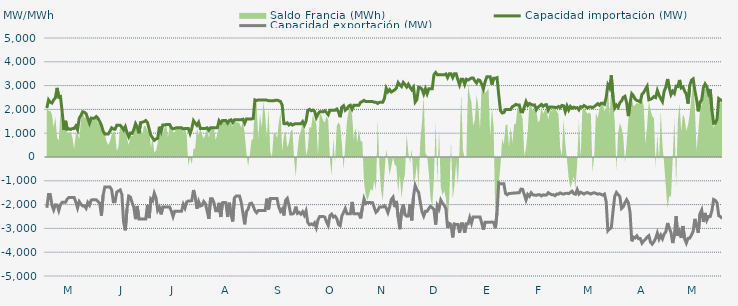
| Category | Capacidad importación (MW) | Capacidad exportación (MW) |
|---|---|---|
| 0 | 2056.25 | -2133.333 |
| 1900-01-01 | 2400 | -1570.833 |
| 1900-01-02 | 2300 | -1570.833 |
| 1900-01-03 | 2266.667 | -2031.25 |
| 1900-01-04 | 2400 | -2225 |
| 1900-01-05 | 2487.5 | -2010.417 |
| 1900-01-06 | 2904.167 | -2016.667 |
| 1900-01-07 | 2512.5 | -2250 |
| 1900-01-08 | 2541.667 | -2000 |
| 1900-01-09 | 1884.392 | -1900 |
| 1900-01-10 | 1133.333 | -1900 |
| 1900-01-11 | 1520.875 | -1900 |
| 1900-01-12 | 1166.667 | -1758.333 |
| 1900-01-13 | 1183.333 | -1700 |
| 1900-01-14 | 1158.333 | -1700 |
| 1900-01-15 | 1200 | -1700 |
| 1900-01-16 | 1200 | -1700 |
| 1900-01-17 | 1304.583 | -1887.5 |
| 1900-01-18 | 1145.417 | -2139.583 |
| 1900-01-19 | 1629.167 | -1875 |
| 1900-01-20 | 1750 | -1987.5 |
| 1900-01-21 | 1900 | -2058.333 |
| 1900-01-22 | 1879.167 | -2050 |
| 1900-01-23 | 1820.833 | -2156.25 |
| 1900-01-24 | 1616.667 | -1912.5 |
| 1900-01-25 | 1420.833 | -2027.083 |
| 1900-01-26 | 1633.333 | -1812.5 |
| 1900-01-27 | 1625 | -1791.667 |
| 1900-01-28 | 1637.5 | -1791.667 |
| 1900-01-29 | 1700 | -1800 |
| 1900-01-30 | 1620.833 | -1868.75 |
| 1900-01-31 | 1487.5 | -1937.5 |
| 1900-02-01 | 1337.5 | -2464.583 |
| 1900-02-02 | 1083.333 | -1610.417 |
| 1900-02-03 | 966.667 | -1258.333 |
| 1900-02-04 | 966.667 | -1258.333 |
| 1900-02-05 | 966.667 | -1258.333 |
| 1900-02-06 | 1083.333 | -1258.333 |
| 1900-02-07 | 1225 | -1375 |
| 1900-02-08 | 1175 | -1875 |
| 1900-02-09 | 1166.667 | -1875 |
| 1900-02-10 | 1333.333 | -1475 |
| 1900-02-11 | 1333.333 | -1425 |
| 1900-02-12 | 1333.333 | -1383.333 |
| 1900-02-13 | 1254.167 | -1577.083 |
| 1900-02-14 | 1133.333 | -2725 |
| 1900-02-15 | 1275 | -3081.25 |
| 1900-02-16 | 1029.167 | -2189.583 |
| 1900-02-17 | 850 | -1641.667 |
| 1900-02-18 | 1008.333 | -1683.333 |
| 1900-02-19 | 991.667 | -1916.667 |
| 1900-02-20 | 1150 | -2114.583 |
| 1900-02-21 | 1400 | -2612.5 |
| 1900-02-22 | 1262.5 | -2058.333 |
| 1900-02-23 | 995.833 | -2600 |
| 1900-02-24 | 1445.833 | -2600 |
| 1900-02-25 | 1458.333 | -2600 |
| 1900-02-26 | 1483.333 | -2600 |
| 1900-02-27 | 1533.333 | -2600 |
| 1900-02-28 | 1450 | -2012.5 |
| 1900-02-28 | 1175 | -2566.667 |
| 1900-03-01 | 912.5 | -1762.5 |
| 1900-03-02 | 806.25 | -1841.667 |
| 1900-03-03 | 700 | -1520.833 |
| 1900-03-04 | 756.25 | -1710.417 |
| 1900-03-05 | 783.333 | -2239.583 |
| 1900-03-06 | 1270.833 | -2112.5 |
| 1900-03-07 | 1066.667 | -2410.417 |
| 1900-03-08 | 1345.833 | -2104.167 |
| 1900-03-09 | 1341.667 | -2104.167 |
| 1900-03-10 | 1366.667 | -2104.167 |
| 1900-03-11 | 1366.667 | -2104.167 |
| 1900-03-12 | 1366.667 | -2104.167 |
| 1900-03-13 | 1231.25 | -2275 |
| 1900-03-14 | 1181.25 | -2504.167 |
| 1900-03-15 | 1200 | -2275 |
| 1900-03-16 | 1233.333 | -2275 |
| 1900-03-17 | 1233.333 | -2275 |
| 1900-03-18 | 1233.333 | -2275 |
| 1900-03-19 | 1233.333 | -2275 |
| 1900-03-20 | 1175 | -1987.5 |
| 1900-03-21 | 1200 | -2147.917 |
| 1900-03-22 | 1200 | -1887.5 |
| 1900-03-23 | 1200 | -1850 |
| 1900-03-24 | 987.5 | -1850 |
| 1900-03-25 | 1200 | -1831.25 |
| 1900-03-26 | 1529.167 | -1387.5 |
| 1900-03-27 | 1427.083 | -1679.167 |
| 1900-03-28 | 1331.25 | -2172.917 |
| 1900-03-29 | 1456.25 | -1868.75 |
| 1900-03-30 | 1200 | -2060.417 |
| 1900-03-31 | 1200 | -2029.167 |
| 1900-04-01 | 1200 | -1868.75 |
| 1900-04-02 | 1200 | -1958.333 |
| 1900-04-03 | 1225 | -2275 |
| 1900-04-04 | 1125 | -2595.833 |
| 1900-04-05 | 1233.333 | -1750 |
| 1900-04-06 | 1233.333 | -1750 |
| 1900-04-07 | 1233.333 | -1925 |
| 1900-04-08 | 1233.333 | -2262.5 |
| 1900-04-09 | 1233.333 | -2262.5 |
| 1900-04-10 | 1525 | -1925 |
| 1900-04-11 | 1425 | -2520.833 |
| 1900-04-12 | 1533.333 | -1920.833 |
| 1900-04-13 | 1533.333 | -1908.333 |
| 1900-04-14 | 1533.333 | -1920.833 |
| 1900-04-15 | 1425 | -2520.833 |
| 1900-04-16 | 1533.333 | -1920.833 |
| 1900-04-17 | 1562.5 | -2412.5 |
| 1900-04-18 | 1454.167 | -2710.417 |
| 1900-04-19 | 1566.667 | -1712.5 |
| 1900-04-20 | 1566.667 | -1641.667 |
| 1900-04-21 | 1566.667 | -1641.667 |
| 1900-04-22 | 1566.667 | -1641.667 |
| 1900-04-23 | 1566.667 | -1904.167 |
| 1900-04-24 | 1587.5 | -2362.5 |
| 1900-04-25 | 1418.75 | -2827.083 |
| 1900-04-26 | 1595.833 | -2297.917 |
| 1900-04-27 | 1595.833 | -2193.75 |
| 1900-04-28 | 1595.833 | -1964.583 |
| 1900-04-29 | 1595.833 | -1937.5 |
| 1900-04-30 | 1618.75 | -2058.333 |
| 1900-05-01 | 2400 | -2250 |
| 1900-05-02 | 2375 | -2341.667 |
| 1900-05-03 | 2400 | -2250 |
| 1900-05-04 | 2400 | -2250 |
| 1900-05-05 | 2400 | -2250 |
| 1900-05-06 | 2400 | -2250 |
| 1900-05-07 | 2400 | -2250 |
| 1900-05-08 | 2387.5 | -1750 |
| 1900-05-09 | 2364.583 | -2208.333 |
| 1900-05-10 | 2364.583 | -1745.833 |
| 1900-05-11 | 2360.417 | -1745.833 |
| 1900-05-12 | 2358.333 | -1745.833 |
| 1900-05-13 | 2387.5 | -1745.833 |
| 1900-05-14 | 2387.5 | -1745.833 |
| 1900-05-15 | 2362.5 | -2100 |
| 1900-05-16 | 2335.417 | -2283.333 |
| 1900-05-17 | 2181.25 | -2187.5 |
| 1900-05-18 | 1408.333 | -2456.25 |
| 1900-05-19 | 1395.833 | -1820.833 |
| 1900-05-20 | 1433.333 | -1737.5 |
| 1900-05-21 | 1345.833 | -2037.5 |
| 1900-05-22 | 1400 | -2400 |
| 1900-05-23 | 1341.667 | -2400 |
| 1900-05-24 | 1383.333 | -2345.833 |
| 1900-05-25 | 1400 | -2087.5 |
| 1900-05-26 | 1400 | -2370.833 |
| 1900-05-27 | 1400 | -2327.083 |
| 1900-05-28 | 1400 | -2400 |
| 1900-05-29 | 1487.5 | -2300 |
| 1900-05-30 | 1337.5 | -2445.833 |
| 1900-05-31 | 1500 | -2266.667 |
| 1900-06-01 | 1958.333 | -2750 |
| 1900-06-02 | 2000 | -2850 |
| 1900-06-03 | 1941.667 | -2812.5 |
| 1900-06-04 | 1975 | -2850 |
| 1900-06-05 | 1920.833 | -2762.5 |
| 1900-06-06 | 1654.167 | -2968.75 |
| 1900-06-07 | 1808.333 | -2639.583 |
| 1900-06-08 | 1900 | -2500 |
| 1900-06-09 | 1900 | -2500 |
| 1900-06-10 | 1900 | -2500 |
| 1900-06-11 | 1950 | -2525 |
| 1900-06-12 | 1866.667 | -2727.083 |
| 1900-06-13 | 1775 | -2877.083 |
| 1900-06-14 | 1966.667 | -2462.5 |
| 1900-06-15 | 1966.667 | -2400 |
| 1900-06-16 | 1966.667 | -2525 |
| 1900-06-17 | 1966.667 | -2483.333 |
| 1900-06-18 | 2016.667 | -2583.333 |
| 1900-06-19 | 1900 | -2837.5 |
| 1900-06-20 | 1675 | -2887.5 |
| 1900-06-21 | 2091.667 | -2477.083 |
| 1900-06-22 | 2154.167 | -2325 |
| 1900-06-23 | 1962.5 | -2162.5 |
| 1900-06-24 | 2029.167 | -2387.5 |
| 1900-06-25 | 2137.5 | -2387.5 |
| 1900-06-26 | 2175 | -2387.5 |
| 1900-06-27 | 2010 | -1886 |
| 1900-06-28 | 2170.833 | -2383.333 |
| 1900-06-29 | 2170.833 | -2383.333 |
| 1900-06-30 | 2170.833 | -2383.333 |
| 1900-07-01 | 2170.833 | -2383.333 |
| 1900-07-02 | 2300 | -2579.167 |
| 1900-07-03 | 2331.25 | -2131.25 |
| 1900-07-04 | 2379.167 | -1758.333 |
| 1900-07-05 | 2329.167 | -1960.417 |
| 1900-07-06 | 2329.167 | -1916.667 |
| 1900-07-07 | 2329.167 | -1916.667 |
| 1900-07-08 | 2329.167 | -1916.667 |
| 1900-07-09 | 2329.167 | -1918.75 |
| 1900-07-10 | 2300 | -2131.25 |
| 1900-07-11 | 2300 | -2325 |
| 1900-07-12 | 2250 | -2256.25 |
| 1900-07-13 | 2300 | -2104.167 |
| 1900-07-14 | 2300 | -2104.167 |
| 1900-07-15 | 2300 | -2104.167 |
| 1900-07-16 | 2475 | -2043.75 |
| 1900-07-17 | 2887.5 | -2150 |
| 1900-07-18 | 2737.5 | -2335.417 |
| 1900-07-19 | 2829.167 | -2106.25 |
| 1900-07-20 | 2732.25 | -1787 |
| 1900-07-21 | 2775 | -1691.667 |
| 1900-07-22 | 2820.833 | -2106.25 |
| 1900-07-23 | 2900 | -1845.833 |
| 1900-07-24 | 3125 | -2520.833 |
| 1900-07-25 | 3025 | -3033.333 |
| 1900-07-26 | 2956.25 | -2250 |
| 1900-07-27 | 3133.333 | -1987.5 |
| 1900-07-28 | 3045.833 | -2425 |
| 1900-07-29 | 2941.667 | -2485.417 |
| 1900-07-30 | 3058.333 | -2483.333 |
| 1900-07-31 | 2925 | -1975 |
| 1900-08-01 | 2825 | -2662.5 |
| 1900-08-02 | 2933.333 | -1658.333 |
| 1900-08-03 | 2312.5 | -1195.833 |
| 1900-08-04 | 2412.5 | -1375 |
| 1900-08-05 | 2933.333 | -1483.333 |
| 1900-08-06 | 2910.417 | -1912.5 |
| 1900-08-07 | 2850 | -2300 |
| 1900-08-08 | 2650 | -2483.333 |
| 1900-08-09 | 2866.667 | -2283.333 |
| 1900-08-10 | 2658.333 | -2283.333 |
| 1900-08-11 | 2866.667 | -2162.5 |
| 1900-08-12 | 2866.667 | -2066.667 |
| 1900-08-13 | 2866.667 | -2129.167 |
| 1900-08-14 | 3456.25 | -2204.167 |
| 1900-08-15 | 3550 | -2837.5 |
| 1900-08-16 | 3454.167 | -2041.667 |
| 1900-08-17 | 3454.167 | -2179.167 |
| 1900-08-18 | 3454.167 | -1808.333 |
| 1900-08-19 | 3454.167 | -1938.75 |
| 1900-08-20 | 3454.167 | -2029.167 |
| 1900-08-21 | 3487.5 | -2175 |
| 1900-08-22 | 3337.5 | -2983.333 |
| 1900-08-23 | 3500 | -2791.667 |
| 1900-08-24 | 3500 | -2833.333 |
| 1900-08-25 | 3337.5 | -3379.167 |
| 1900-08-26 | 3500 | -2812.5 |
| 1900-08-27 | 3500 | -2833.333 |
| 1900-08-28 | 3250 | -2837.5 |
| 1900-08-29 | 3028.25 | -3181.25 |
| 1900-08-30 | 3266.667 | -2808.333 |
| 1900-08-31 | 3266.667 | -2808.333 |
| 1900-09-01 | 3050 | -3181.25 |
| 1900-09-02 | 3266.667 | -2808.333 |
| 1900-09-03 | 3233.333 | -2808.333 |
| 1900-09-04 | 3275 | -2543.75 |
| 1900-09-05 | 3320.833 | -2779.167 |
| 1900-09-06 | 3320.833 | -2516.667 |
| 1900-09-07 | 3195.833 | -2516.667 |
| 1900-09-08 | 3108.333 | -2516.667 |
| 1900-09-09 | 3241.667 | -2516.667 |
| 1900-09-10 | 3212.5 | -2516.667 |
| 1900-09-11 | 3054.167 | -2775 |
| 1900-09-12 | 2862.5 | -3058.333 |
| 1900-09-13 | 3162.5 | -2741.667 |
| 1900-09-14 | 3366.667 | -2741.667 |
| 1900-09-15 | 3366.667 | -2741.667 |
| 1900-09-16 | 3366.667 | -2741.667 |
| 1900-09-17 | 3041.667 | -2729.167 |
| 1900-09-18 | 3306.25 | -2750 |
| 1900-09-19 | 3306.25 | -2991.667 |
| 1900-09-20 | 3333.333 | -2337.5 |
| 1900-09-21 | 2602.083 | -1083.333 |
| 1900-09-22 | 1950 | -1125 |
| 1900-09-23 | 1850 | -1125 |
| 1900-09-24 | 1866.667 | -1125 |
| 1900-09-25 | 2000 | -1537.5 |
| 1900-09-26 | 2000 | -1587.5 |
| 1900-09-27 | 2000 | -1529.167 |
| 1900-09-28 | 2000 | -1529.167 |
| 1900-09-29 | 2114.583 | -1525 |
| 1900-09-30 | 2154.167 | -1512.5 |
| 1900-10-01 | 2210.417 | -1516.667 |
| 1900-10-02 | 2183.333 | -1500 |
| 1900-10-03 | 2185.417 | -1500 |
| 1900-10-04 | 1906.25 | -1350 |
| 1900-10-05 | 1893.75 | -1358.333 |
| 1900-10-06 | 2104.167 | -1579.167 |
| 1900-10-07 | 2328.375 | -1804.167 |
| 1900-10-08 | 2166.667 | -1572.917 |
| 1900-10-09 | 2250 | -1650 |
| 1900-10-10 | 2212.5 | -1502.083 |
| 1900-10-11 | 2179.167 | -1589.583 |
| 1900-10-12 | 2187.5 | -1600 |
| 1900-10-13 | 1987.5 | -1612.5 |
| 1900-10-14 | 2091.667 | -1581.25 |
| 1900-10-15 | 2147.917 | -1581.25 |
| 1900-10-16 | 2208.333 | -1635.417 |
| 1900-10-17 | 2127.083 | -1589.583 |
| 1900-10-18 | 2185.417 | -1604.167 |
| 1900-10-19 | 2200 | -1597.917 |
| 1900-10-20 | 1966.667 | -1500 |
| 1900-10-21 | 2104.167 | -1545.833 |
| 1900-10-22 | 2102.083 | -1583.333 |
| 1900-10-23 | 2089.583 | -1581.25 |
| 1900-10-24 | 2085.417 | -1627.083 |
| 1900-10-25 | 2075 | -1554.167 |
| 1900-10-26 | 2122.917 | -1562.5 |
| 1900-10-27 | 2072.917 | -1508.333 |
| 1900-10-28 | 2166.667 | -1539.583 |
| 1900-10-29 | 2152.083 | -1560.417 |
| 1900-10-30 | 1908.333 | -1531.25 |
| 1900-10-31 | 2145.833 | -1525 |
| 1900-11-01 | 1972.917 | -1539.583 |
| 1900-11-02 | 2125 | -1491.667 |
| 1900-11-03 | 2050 | -1437.5 |
| 1900-11-04 | 2095.833 | -1539.583 |
| 1900-11-05 | 2062.5 | -1562.5 |
| 1900-11-06 | 2075 | -1368.75 |
| 1900-11-07 | 1979.167 | -1556.25 |
| 1900-11-08 | 2116.667 | -1481.25 |
| 1900-11-09 | 2093.75 | -1516.667 |
| 1900-11-10 | 2164.583 | -1556.25 |
| 1900-11-11 | 2116.667 | -1508.333 |
| 1900-11-12 | 2060.417 | -1493.75 |
| 1900-11-13 | 2102.083 | -1525 |
| 1900-11-14 | 2100 | -1556.25 |
| 1900-11-15 | 2075 | -1520.833 |
| 1900-11-16 | 2118.75 | -1500 |
| 1900-11-17 | 2177.083 | -1529.167 |
| 1900-11-18 | 2239.583 | -1562.5 |
| 1900-11-19 | 2177.083 | -1543.75 |
| 1900-11-20 | 2262.5 | -1568.75 |
| 1900-11-21 | 2260.417 | -1602.083 |
| 1900-11-22 | 2214.583 | -1556.25 |
| 1900-11-23 | 2506.25 | -1879.583 |
| 1900-11-24 | 3029.083 | -3096.667 |
| 1900-11-25 | 2897.083 | -3021.292 |
| 1900-11-26 | 3432.292 | -2977.083 |
| 1900-11-27 | 2507.25 | -2284.333 |
| 1900-11-28 | 2060.87 | -1658.696 |
| 1900-11-29 | 2179.167 | -1489.583 |
| 1900-11-30 | 2087.5 | -1575 |
| 1900-12-01 | 2277.417 | -1660.417 |
| 1900-12-02 | 2351.25 | -2160.417 |
| 1900-12-03 | 2503.458 | -2091.667 |
| 1900-12-04 | 2550 | -1920.833 |
| 1900-12-05 | 2281.458 | -1791.667 |
| 1900-12-06 | 1718.75 | -1920.833 |
| 1900-12-07 | 2254.5 | -2322.583 |
| 1900-12-08 | 2658.208 | -3541.417 |
| 1900-12-09 | 2574.708 | -3362.292 |
| 1900-12-10 | 2431.25 | -3398.958 |
| 1900-12-11 | 2374.5 | -3312.25 |
| 1900-12-12 | 2351.333 | -3435.417 |
| 1900-12-13 | 2317.583 | -3426.125 |
| 1900-12-14 | 2635.542 | -3620.708 |
| 1900-12-15 | 2711.542 | -3524.292 |
| 1900-12-16 | 2845.917 | -3464.708 |
| 1900-12-17 | 2969.417 | -3364.5 |
| 1900-12-18 | 2400.667 | -3304.667 |
| 1900-12-19 | 2423.292 | -3576.333 |
| 1900-12-20 | 2466.583 | -3661.208 |
| 1900-12-21 | 2539.583 | -3559.167 |
| 1900-12-22 | 2499 | -3412.958 |
| 1900-12-23 | 2794.042 | -3192.833 |
| 1900-12-24 | 2600.917 | -3446.833 |
| 1900-12-25 | 2454.333 | -3287.042 |
| 1900-12-26 | 2327 | -3437.333 |
| 1900-12-27 | 2764.875 | -3237.25 |
| 1900-12-28 | 2938.333 | -3142.542 |
| 1900-12-29 | 3277.667 | -2773.208 |
| 1900-12-30 | 2901.792 | -2987.042 |
| 1900-12-31 | 2620.125 | -3170.125 |
| 1901-01-01 | 2763 | -3616.833 |
| 1901-01-02 | 2671.542 | -3275.667 |
| 1901-01-03 | 2975.208 | -2481.333 |
| 1901-01-04 | 2963.292 | -3314.083 |
| 1901-01-05 | 3237.125 | -3127.25 |
| 1901-01-06 | 2903.125 | -3401.25 |
| 1901-01-07 | 2943.875 | -2899.917 |
| 1901-01-08 | 2767.417 | -3439.375 |
| 1901-01-09 | 2641.75 | -3616.75 |
| 1901-01-10 | 2244.417 | -3416.167 |
| 1901-01-11 | 3003.875 | -3408.875 |
| 1901-01-12 | 3226.875 | -3283.375 |
| 1901-01-13 | 3282.292 | -3121.542 |
| 1901-01-14 | 2800 | -2600 |
| 1901-01-15 | 2416.667 | -2918.75 |
| 1901-01-16 | 1920.333 | -3184.333 |
| 1901-01-17 | 2307.917 | -2385.917 |
| 1901-01-18 | 2390.792 | -2227.542 |
| 1901-01-19 | 2911.125 | -2730 |
| 1901-01-20 | 3070.25 | -2350.458 |
| 1901-01-21 | 2956.667 | -2656.375 |
| 1901-01-22 | 2670.833 | -2500 |
| 1901-01-23 | 2854.167 | -2500 |
| 1901-01-24 | 1964.208 | -2255.75 |
| 1901-01-25 | 1414.583 | -1785.417 |
| 1901-01-26 | 1420.833 | -1825 |
| 1901-01-27 | 1591.667 | -1922.917 |
| 1901-01-28 | 2454.167 | -2465 |
| 1901-01-29 | 2398.083 | -2503.583 |
| 1901-01-30 | 2366.667 | -2588.042 |